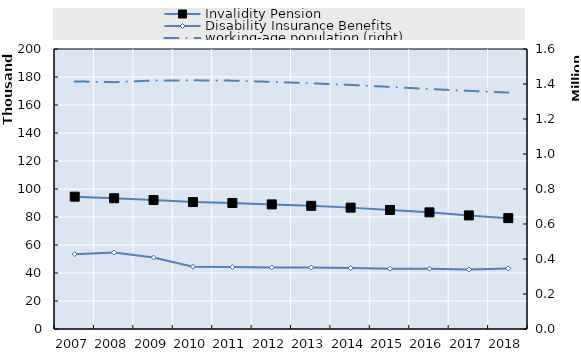
| Category | Invalidity Pension | Disability Insurance Benefits |
|---|---|---|
| 2007.0 | 94511 | 53473 |
| 2008.0 | 93389 | 54647 |
| 2009.0 | 92123 | 51042 |
| 2010.0 | 90670 | 44491 |
| 2011.0 | 89992 | 44265 |
| 2012.0 | 89002 | 43995 |
| 2013.0 | 87984 | 43909 |
| 2014.0 | 86696 | 43490 |
| 2015.0 | 85023 | 43049 |
| 2016.0 | 83324 | 43060 |
| 2017.0 | 81145 | 42506 |
| 2018.0 | 79187 | 43295 |